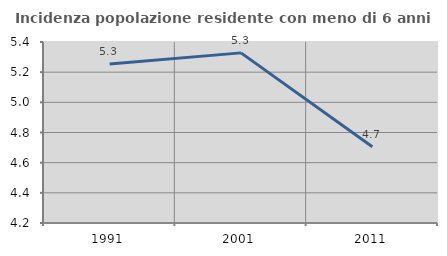
| Category | Incidenza popolazione residente con meno di 6 anni |
|---|---|
| 1991.0 | 5.255 |
| 2001.0 | 5.328 |
| 2011.0 | 4.706 |